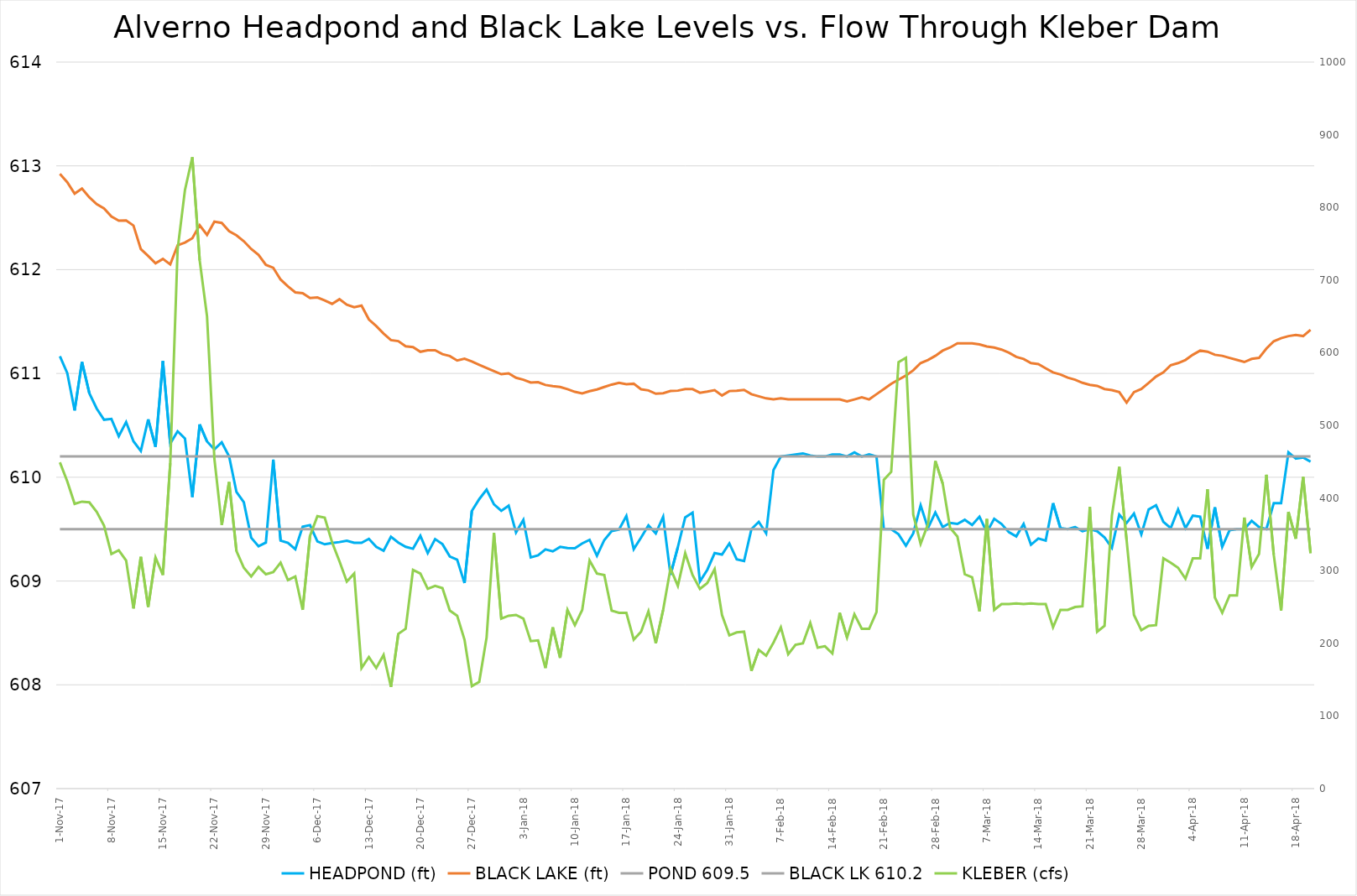
| Category | HEADPOND (ft) | BLACK LAKE (ft) | POND 609.5 | BLACK LK 610.2 |
|---|---|---|---|---|
| 2017-11-01 | 611.166 | 612.922 | 609.5 | 610.2 |
| 2017-11-02 | 611.004 | 612.842 | 609.5 | 610.2 |
| 2017-11-03 | 610.644 | 612.733 | 609.5 | 610.2 |
| 2017-11-04 | 611.111 | 612.782 | 609.5 | 610.2 |
| 2017-11-05 | 610.81 | 612.698 | 609.5 | 610.2 |
| 2017-11-06 | 610.662 | 612.632 | 609.5 | 610.2 |
| 2017-11-07 | 610.554 | 612.589 | 609.5 | 610.2 |
| 2017-11-08 | 610.562 | 612.513 | 609.5 | 610.2 |
| 2017-11-09 | 610.396 | 612.472 | 609.5 | 610.2 |
| 2017-11-10 | 610.532 | 612.473 | 609.5 | 610.2 |
| 2017-11-11 | 610.346 | 612.425 | 609.5 | 610.2 |
| 2017-11-12 | 610.253 | 612.198 | 609.5 | 610.2 |
| 2017-11-13 | 610.557 | 612.132 | 609.5 | 610.2 |
| 2017-11-14 | 610.294 | 612.061 | 609.5 | 610.2 |
| 2017-11-15 | 611.119 | 612.104 | 609.5 | 610.2 |
| 2017-11-16 | 610.325 | 612.051 | 609.5 | 610.2 |
| 2017-11-17 | 610.443 | 612.235 | 609.5 | 610.2 |
| 2017-11-18 | 610.373 | 612.261 | 609.5 | 610.2 |
| 2017-11-19 | 609.809 | 612.303 | 609.5 | 610.2 |
| 2017-11-20 | 610.509 | 612.427 | 609.5 | 610.2 |
| 2017-11-21 | 610.344 | 612.336 | 609.5 | 610.2 |
| 2017-11-22 | 610.268 | 612.462 | 609.5 | 610.2 |
| 2017-11-23 | 610.337 | 612.45 | 609.5 | 610.2 |
| 2017-11-24 | 610.2 | 612.371 | 609.5 | 610.2 |
| 2017-11-25 | 609.857 | 612.331 | 609.5 | 610.2 |
| 2017-11-26 | 609.76 | 612.274 | 609.5 | 610.2 |
| 2017-11-27 | 609.418 | 612.199 | 609.5 | 610.2 |
| 2017-11-28 | 609.335 | 612.143 | 609.5 | 610.2 |
| 2017-11-29 | 609.371 | 612.046 | 609.5 | 610.2 |
| 2017-11-30 | 610.17 | 612.018 | 609.5 | 610.2 |
| 2017-12-01 | 609.39 | 611.905 | 609.5 | 610.2 |
| 2017-12-02 | 609.367 | 611.839 | 609.5 | 610.2 |
| 2017-12-03 | 609.306 | 611.781 | 609.5 | 610.2 |
| 2017-12-04 | 609.525 | 611.774 | 609.5 | 610.2 |
| 2017-12-05 | 609.539 | 611.727 | 609.5 | 610.2 |
| 2017-12-06 | 609.381 | 611.732 | 609.5 | 610.2 |
| 2017-12-07 | 609.354 | 611.703 | 609.5 | 610.2 |
| 2017-12-08 | 609.366 | 611.67 | 609.5 | 610.2 |
| 2017-12-09 | 609.375 | 611.715 | 609.5 | 610.2 |
| 2017-12-10 | 609.388 | 611.662 | 609.5 | 610.2 |
| 2017-12-11 | 609.369 | 611.638 | 609.5 | 610.2 |
| 2017-12-12 | 609.369 | 611.653 | 609.5 | 610.2 |
| 2017-12-13 | 609.407 | 611.52 | 609.5 | 610.2 |
| 2017-12-14 | 609.329 | 611.457 | 609.5 | 610.2 |
| 2017-12-15 | 609.291 | 611.384 | 609.5 | 610.2 |
| 2017-12-16 | 609.427 | 611.321 | 609.5 | 610.2 |
| 2017-12-17 | 609.371 | 611.312 | 609.5 | 610.2 |
| 2017-12-18 | 609.33 | 611.261 | 609.5 | 610.2 |
| 2017-12-19 | 609.311 | 611.254 | 609.5 | 610.2 |
| 2017-12-20 | 609.436 | 611.209 | 609.5 | 610.2 |
| 2017-12-21 | 609.269 | 611.223 | 609.5 | 610.2 |
| 2017-12-22 | 609.404 | 611.224 | 609.5 | 610.2 |
| 2017-12-23 | 609.355 | 611.186 | 609.5 | 610.2 |
| 2017-12-24 | 609.236 | 611.168 | 609.5 | 610.2 |
| 2017-12-25 | 609.206 | 611.125 | 609.5 | 610.2 |
| 2017-12-26 | 608.981 | 611.142 | 609.5 | 610.2 |
| 2017-12-27 | 609.676 | 611.115 | 609.5 | 610.2 |
| 2017-12-28 | 609.789 | 611.084 | 609.5 | 610.2 |
| 2017-12-29 | 609.881 | 611.053 | 609.5 | 610.2 |
| 2017-12-30 | 609.739 | 611.022 | 609.5 | 610.2 |
| 2017-12-31 | 609.676 | 610.992 | 609.5 | 610.2 |
| 2018-01-01 | 609.726 | 611.001 | 609.5 | 610.2 |
| 2018-01-02 | 609.469 | 610.958 | 609.5 | 610.2 |
| 2018-01-03 | 609.59 | 610.939 | 609.5 | 610.2 |
| 2018-01-04 | 609.227 | 610.913 | 609.5 | 610.2 |
| 2018-01-05 | 609.247 | 610.915 | 609.5 | 610.2 |
| 2018-01-06 | 609.305 | 610.889 | 609.5 | 610.2 |
| 2018-01-07 | 609.286 | 610.878 | 609.5 | 610.2 |
| 2018-01-08 | 609.329 | 610.869 | 609.5 | 610.2 |
| 2018-01-09 | 609.317 | 610.848 | 609.5 | 610.2 |
| 2018-01-10 | 609.317 | 610.823 | 609.5 | 610.2 |
| 2018-01-11 | 609.362 | 610.808 | 609.5 | 610.2 |
| 2018-01-12 | 609.397 | 610.83 | 609.5 | 610.2 |
| 2018-01-13 | 609.243 | 610.845 | 609.5 | 610.2 |
| 2018-01-14 | 609.395 | 610.869 | 609.5 | 610.2 |
| 2018-01-15 | 609.481 | 610.893 | 609.5 | 610.2 |
| 2018-01-16 | 609.496 | 610.909 | 609.5 | 610.2 |
| 2018-01-17 | 609.627 | 610.897 | 609.5 | 610.2 |
| 2018-01-18 | 609.307 | 610.901 | 609.5 | 610.2 |
| 2018-01-19 | 609.419 | 610.847 | 609.5 | 610.2 |
| 2018-01-20 | 609.537 | 610.837 | 609.5 | 610.2 |
| 2018-01-21 | 609.459 | 610.805 | 609.5 | 610.2 |
| 2018-01-22 | 609.618 | 610.81 | 609.5 | 610.2 |
| 2018-01-23 | 609.06 | 610.831 | 609.5 | 610.2 |
| 2018-01-24 | 609.327 | 610.834 | 609.5 | 610.2 |
| 2018-01-25 | 609.613 | 610.85 | 609.5 | 610.2 |
| 2018-01-26 | 609.659 | 610.849 | 609.5 | 610.2 |
| 2018-01-27 | 608.996 | 610.814 | 609.5 | 610.2 |
| 2018-01-28 | 609.108 | 610.825 | 609.5 | 610.2 |
| 2018-01-29 | 609.269 | 610.839 | 609.5 | 610.2 |
| 2018-01-30 | 609.255 | 610.788 | 609.5 | 610.2 |
| 2018-01-31 | 609.362 | 610.83 | 609.5 | 610.2 |
| 2018-02-01 | 609.21 | 610.834 | 609.5 | 610.2 |
| 2018-02-02 | 609.193 | 610.842 | 609.5 | 610.2 |
| 2018-02-03 | 609.5 | 610.8 | 609.5 | 610.2 |
| 2018-02-04 | 609.57 | 610.78 | 609.5 | 610.2 |
| 2018-02-05 | 609.46 | 610.76 | 609.5 | 610.2 |
| 2018-02-06 | 610.07 | 610.75 | 609.5 | 610.2 |
| 2018-02-07 | 610.2 | 610.76 | 609.5 | 610.2 |
| 2018-02-08 | 610.21 | 610.75 | 609.5 | 610.2 |
| 2018-02-09 | 610.22 | 610.75 | 609.5 | 610.2 |
| 2018-02-10 | 610.23 | 610.75 | 609.5 | 610.2 |
| 2018-02-11 | 610.21 | 610.75 | 609.5 | 610.2 |
| 2018-02-12 | 610.2 | 610.75 | 609.5 | 610.2 |
| 2018-02-13 | 610.2 | 610.75 | 609.5 | 610.2 |
| 2018-02-14 | 610.22 | 610.75 | 609.5 | 610.2 |
| 2018-02-15 | 610.22 | 610.75 | 609.5 | 610.2 |
| 2018-02-16 | 610.2 | 610.73 | 609.5 | 610.2 |
| 2018-02-17 | 610.24 | 610.75 | 609.5 | 610.2 |
| 2018-02-18 | 610.2 | 610.77 | 609.5 | 610.2 |
| 2018-02-19 | 610.22 | 610.75 | 609.5 | 610.2 |
| 2018-02-20 | 610.2 | 610.8 | 609.5 | 610.2 |
| 2018-02-21 | 609.5 | 610.85 | 609.5 | 610.2 |
| 2018-02-22 | 609.5 | 610.9 | 609.5 | 610.2 |
| 2018-02-23 | 609.45 | 610.94 | 609.5 | 610.2 |
| 2018-02-24 | 609.34 | 610.98 | 609.5 | 610.2 |
| 2018-02-25 | 609.46 | 611.03 | 609.5 | 610.2 |
| 2018-02-26 | 609.73 | 611.1 | 609.5 | 610.2 |
| 2018-02-27 | 609.51 | 611.13 | 609.5 | 610.2 |
| 2018-02-28 | 609.66 | 611.17 | 609.5 | 610.2 |
| 2018-03-01 | 609.52 | 611.22 | 609.5 | 610.2 |
| 2018-03-02 | 609.56 | 611.25 | 609.5 | 610.2 |
| 2018-03-03 | 609.55 | 611.29 | 609.5 | 610.2 |
| 2018-03-04 | 609.59 | 611.29 | 609.5 | 610.2 |
| 2018-03-05 | 609.54 | 611.29 | 609.5 | 610.2 |
| 2018-03-06 | 609.62 | 611.28 | 609.5 | 610.2 |
| 2018-03-07 | 609.47 | 611.26 | 609.5 | 610.2 |
| 2018-03-08 | 609.6 | 611.25 | 609.5 | 610.2 |
| 2018-03-09 | 609.55 | 611.23 | 609.5 | 610.2 |
| 2018-03-10 | 609.47 | 611.2 | 609.5 | 610.2 |
| 2018-03-11 | 609.43 | 611.16 | 609.5 | 610.2 |
| 2018-03-12 | 609.55 | 611.14 | 609.5 | 610.2 |
| 2018-03-13 | 609.35 | 611.1 | 609.5 | 610.2 |
| 2018-03-14 | 609.41 | 611.09 | 609.5 | 610.2 |
| 2018-03-15 | 609.39 | 611.05 | 609.5 | 610.2 |
| 2018-03-16 | 609.75 | 611.01 | 609.5 | 610.2 |
| 2018-03-17 | 609.51 | 610.99 | 609.5 | 610.2 |
| 2018-03-18 | 609.5 | 610.96 | 609.5 | 610.2 |
| 2018-03-19 | 609.52 | 610.94 | 609.5 | 610.2 |
| 2018-03-20 | 609.48 | 610.91 | 609.5 | 610.2 |
| 2018-03-21 | 609.5 | 610.89 | 609.5 | 610.2 |
| 2018-03-22 | 609.48 | 610.88 | 609.5 | 610.2 |
| 2018-03-23 | 609.42 | 610.85 | 609.5 | 610.2 |
| 2018-03-24 | 609.32 | 610.84 | 609.5 | 610.2 |
| 2018-03-25 | 609.64 | 610.82 | 609.5 | 610.2 |
| 2018-03-26 | 609.56 | 610.72 | 609.5 | 610.2 |
| 2018-03-27 | 609.65 | 610.82 | 609.5 | 610.2 |
| 2018-03-28 | 609.45 | 610.85 | 609.5 | 610.2 |
| 2018-03-29 | 609.69 | 610.91 | 609.5 | 610.2 |
| 2018-03-30 | 609.73 | 610.97 | 609.5 | 610.2 |
| 2018-03-31 | 609.57 | 611.01 | 609.5 | 610.2 |
| 2018-04-01 | 609.51 | 611.08 | 609.5 | 610.2 |
| 2018-04-02 | 609.69 | 611.1 | 609.5 | 610.2 |
| 2018-04-03 | 609.51 | 611.13 | 609.5 | 610.2 |
| 2018-04-04 | 609.63 | 611.18 | 609.5 | 610.2 |
| 2018-04-05 | 609.62 | 611.22 | 609.5 | 610.2 |
| 2018-04-06 | 609.31 | 611.21 | 609.5 | 610.2 |
| 2018-04-07 | 609.71 | 611.18 | 609.5 | 610.2 |
| 2018-04-08 | 609.33 | 611.17 | 609.5 | 610.2 |
| 2018-04-09 | 609.49 | 611.15 | 609.5 | 610.2 |
| 2018-04-10 | 609.5 | 611.13 | 609.5 | 610.2 |
| 2018-04-11 | 609.5 | 611.11 | 609.5 | 610.2 |
| 2018-04-12 | 609.58 | 611.14 | 609.5 | 610.2 |
| 2018-04-13 | 609.52 | 611.15 | 609.5 | 610.2 |
| 2018-04-14 | 609.5 | 611.24 | 609.5 | 610.2 |
| 2018-04-15 | 609.75 | 611.31 | 609.5 | 610.2 |
| 2018-04-16 | 609.75 | 611.34 | 609.5 | 610.2 |
| 2018-04-17 | 610.24 | 611.36 | 609.5 | 610.2 |
| 2018-04-18 | 610.18 | 611.37 | 609.5 | 610.2 |
| 2018-04-19 | 610.19 | 611.36 | 609.5 | 610.2 |
| 2018-04-20 | 610.15 | 611.42 | 609.5 | 610.2 |